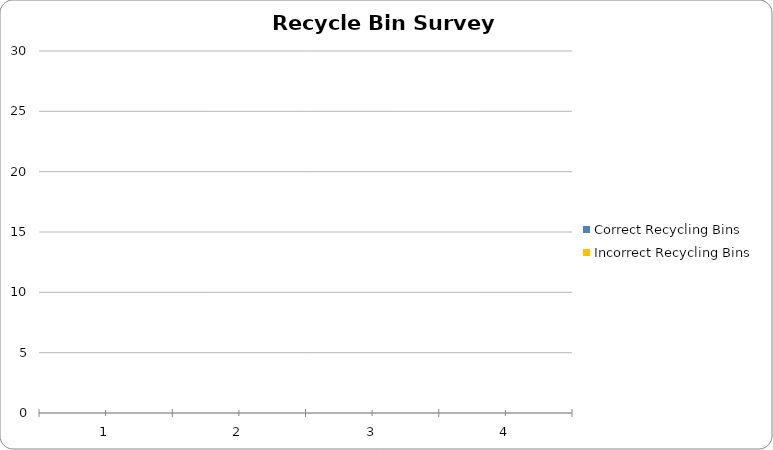
| Category | Correct Recycling Bins | Incorrect Recycling Bins |
|---|---|---|
| 0 | 0 | 0 |
| 1 | 0 | 0 |
| 2 | 0 | 0 |
| 3 | 0 | 0 |